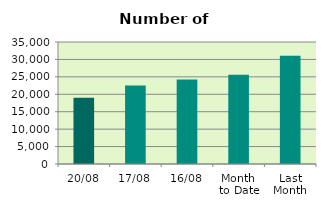
| Category | Series 0 |
|---|---|
| 20/08 | 19012 |
| 17/08 | 22506 |
| 16/08 | 24210 |
| Month 
to Date | 25580.429 |
| Last
Month | 31061.545 |